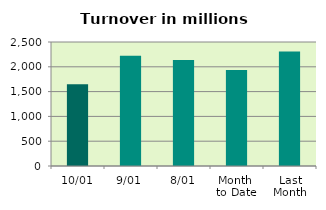
| Category | Series 0 |
|---|---|
| 10/01 | 1647.551 |
| 9/01 | 2221.801 |
| 8/01 | 2139.311 |
| Month 
to Date | 1937.293 |
| Last
Month | 2307.928 |